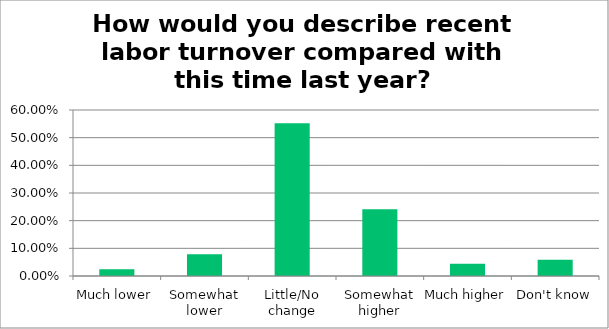
| Category | Responses |
|---|---|
| Much lower | 0.025 |
| Somewhat lower | 0.079 |
| Little/No change | 0.552 |
| Somewhat higher | 0.241 |
| Much higher | 0.044 |
| Don't know | 0.059 |